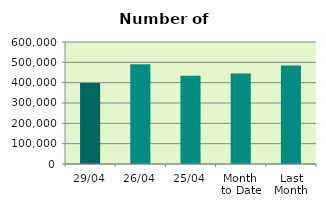
| Category | Series 0 |
|---|---|
| 29/04 | 398860 |
| 26/04 | 490684 |
| 25/04 | 434166 |
| Month 
to Date | 445435.158 |
| Last
Month | 483948.286 |